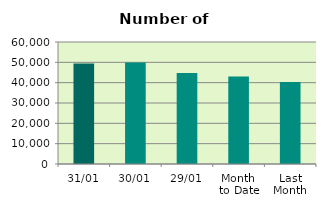
| Category | Series 0 |
|---|---|
| 31/01 | 49378 |
| 30/01 | 49954 |
| 29/01 | 44774 |
| Month 
to Date | 43047.455 |
| Last
Month | 40313.8 |